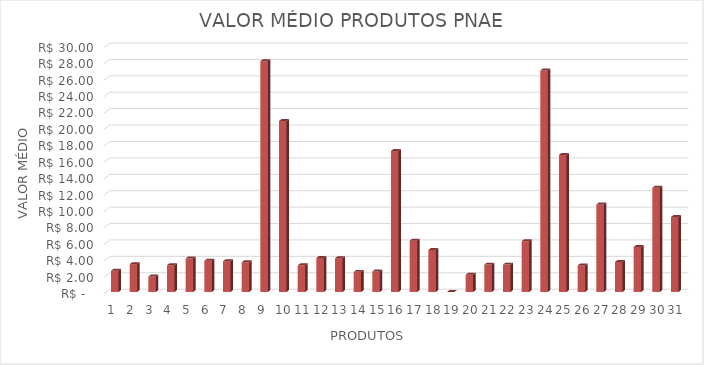
| Category | Series 0 |
|---|---|
| 0 | 2.583 |
| 1 | 3.383 |
| 2 | 1.883 |
| 3 | 3.26 |
| 4 | 4.1 |
| 5 | 3.8 |
| 6 | 3.747 |
| 7 | 3.623 |
| 8 | 28.12 |
| 9 | 20.83 |
| 10 | 3.25 |
| 11 | 4.14 |
| 12 | 4.117 |
| 13 | 2.45 |
| 14 | 2.5 |
| 15 | 17.185 |
| 16 | 6.25 |
| 17 | 5.117 |
| 18 | 0 |
| 19 | 2.1 |
| 20 | 3.34 |
| 21 | 3.34 |
| 22 | 6.2 |
| 23 | 27 |
| 24 | 16.707 |
| 25 | 3.24 |
| 26 | 10.667 |
| 27 | 3.653 |
| 28 | 5.483 |
| 29 | 12.7 |
| 30 | 9.133 |